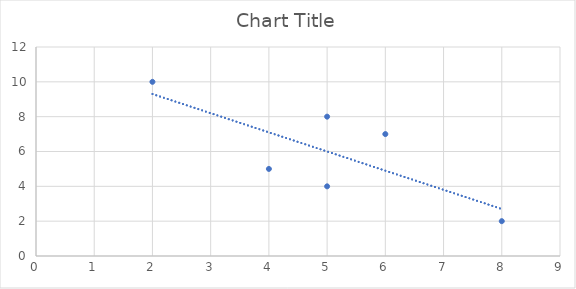
| Category | Series 0 |
|---|---|
| 2.0 | 10 |
| 4.0 | 5 |
| 5.0 | 4 |
| 5.0 | 8 |
| 6.0 | 7 |
| 8.0 | 2 |